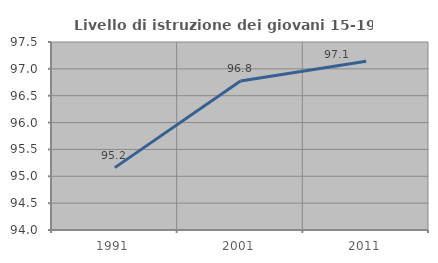
| Category | Livello di istruzione dei giovani 15-19 anni |
|---|---|
| 1991.0 | 95.161 |
| 2001.0 | 96.774 |
| 2011.0 | 97.143 |